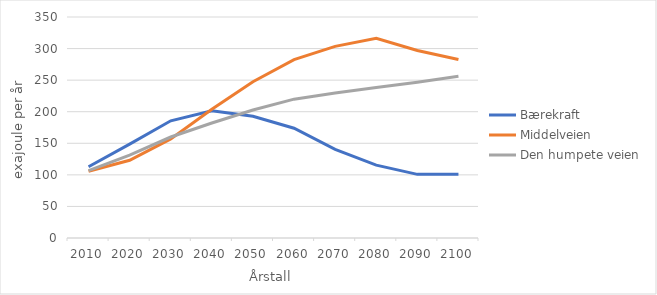
| Category | Bærekraft | Middelveien | Den humpete veien |
|---|---|---|---|
| 2010.0 | 112.796 | 105.706 | 106.729 |
| 2020.0 | 148.663 | 123.163 | 131.377 |
| 2030.0 | 185.6 | 156.878 | 159.929 |
| 2040.0 | 201.586 | 204.03 | 182.15 |
| 2050.0 | 192.826 | 247.435 | 202.79 |
| 2060.0 | 173.84 | 282.524 | 219.898 |
| 2070.0 | 140.327 | 303.444 | 229.676 |
| 2080.0 | 115.378 | 316.374 | 238.176 |
| 2090.0 | 100.792 | 296.862 | 246.773 |
| 2100.0 | 100.962 | 282.655 | 256.118 |